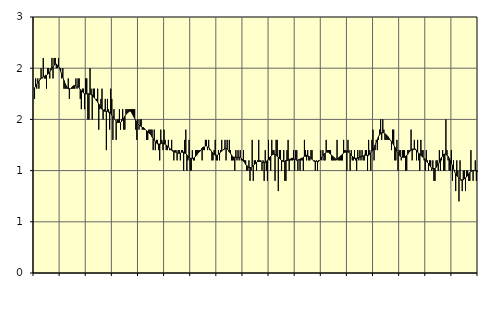
| Category | Jordbruk, skogsbruk o fiske, SNI 01-03 | Series 1 |
|---|---|---|
| nan | 1.7 | 1.81 |
| 87.0 | 1.9 | 1.82 |
| 87.0 | 1.8 | 1.84 |
| 87.0 | 1.9 | 1.86 |
| 87.0 | 1.8 | 1.87 |
| 87.0 | 1.9 | 1.89 |
| 87.0 | 2 | 1.9 |
| 87.0 | 1.9 | 1.91 |
| 87.0 | 2.1 | 1.92 |
| 87.0 | 1.9 | 1.92 |
| 87.0 | 1.9 | 1.93 |
| 87.0 | 1.8 | 1.93 |
| nan | 2 | 1.94 |
| 88.0 | 2 | 1.95 |
| 88.0 | 1.9 | 1.96 |
| 88.0 | 2 | 1.98 |
| 88.0 | 2.1 | 2 |
| 88.0 | 1.9 | 2.01 |
| 88.0 | 2.1 | 2.03 |
| 88.0 | 2.1 | 2.04 |
| 88.0 | 2 | 2.04 |
| 88.0 | 2 | 2.03 |
| 88.0 | 2.1 | 2.02 |
| 88.0 | 2 | 2 |
| nan | 2 | 1.97 |
| 89.0 | 1.9 | 1.94 |
| 89.0 | 2 | 1.91 |
| 89.0 | 1.8 | 1.88 |
| 89.0 | 1.8 | 1.85 |
| 89.0 | 1.8 | 1.83 |
| 89.0 | 1.8 | 1.81 |
| 89.0 | 1.9 | 1.8 |
| 89.0 | 1.7 | 1.8 |
| 89.0 | 1.8 | 1.8 |
| 89.0 | 1.8 | 1.81 |
| 89.0 | 1.8 | 1.82 |
| nan | 1.8 | 1.83 |
| 90.0 | 1.8 | 1.83 |
| 90.0 | 1.9 | 1.83 |
| 90.0 | 1.8 | 1.82 |
| 90.0 | 1.9 | 1.82 |
| 90.0 | 1.9 | 1.81 |
| 90.0 | 1.7 | 1.79 |
| 90.0 | 1.6 | 1.78 |
| 90.0 | 1.8 | 1.77 |
| 90.0 | 1.8 | 1.76 |
| 90.0 | 1.6 | 1.75 |
| 90.0 | 1.9 | 1.75 |
| nan | 1.9 | 1.75 |
| 91.0 | 1.5 | 1.75 |
| 91.0 | 1.5 | 1.75 |
| 91.0 | 2 | 1.75 |
| 91.0 | 1.8 | 1.74 |
| 91.0 | 1.5 | 1.74 |
| 91.0 | 1.8 | 1.72 |
| 91.0 | 1.8 | 1.71 |
| 91.0 | 1.7 | 1.7 |
| 91.0 | 1.7 | 1.68 |
| 91.0 | 1.8 | 1.67 |
| 91.0 | 1.4 | 1.65 |
| nan | 1.6 | 1.63 |
| 92.0 | 1.7 | 1.61 |
| 92.0 | 1.8 | 1.6 |
| 92.0 | 1.5 | 1.59 |
| 92.0 | 1.6 | 1.58 |
| 92.0 | 1.7 | 1.58 |
| 92.0 | 1.2 | 1.58 |
| 92.0 | 1.7 | 1.58 |
| 92.0 | 1.6 | 1.57 |
| 92.0 | 1.4 | 1.57 |
| 92.0 | 1.8 | 1.56 |
| 92.0 | 1.7 | 1.54 |
| nan | 1.3 | 1.53 |
| 93.0 | 1.6 | 1.51 |
| 93.0 | 1.5 | 1.5 |
| 93.0 | 1.3 | 1.48 |
| 93.0 | 1.5 | 1.47 |
| 93.0 | 1.5 | 1.47 |
| 93.0 | 1.6 | 1.47 |
| 93.0 | 1.4 | 1.47 |
| 93.0 | 1.5 | 1.48 |
| 93.0 | 1.6 | 1.5 |
| 93.0 | 1.4 | 1.51 |
| 93.0 | 1.4 | 1.53 |
| nan | 1.6 | 1.55 |
| 94.0 | 1.6 | 1.56 |
| 94.0 | 1.6 | 1.57 |
| 94.0 | 1.6 | 1.58 |
| 94.0 | 1.6 | 1.58 |
| 94.0 | 1.6 | 1.57 |
| 94.0 | 1.6 | 1.55 |
| 94.0 | 1.6 | 1.53 |
| 94.0 | 1.6 | 1.51 |
| 94.0 | 1.4 | 1.49 |
| 94.0 | 1.3 | 1.47 |
| 94.0 | 1.5 | 1.46 |
| nan | 1.4 | 1.44 |
| 95.0 | 1.5 | 1.44 |
| 95.0 | 1.5 | 1.43 |
| 95.0 | 1.4 | 1.42 |
| 95.0 | 1.4 | 1.42 |
| 95.0 | 1.4 | 1.41 |
| 95.0 | 1.4 | 1.4 |
| 95.0 | 1.3 | 1.39 |
| 95.0 | 1.3 | 1.38 |
| 95.0 | 1.4 | 1.37 |
| 95.0 | 1.4 | 1.36 |
| 95.0 | 1.4 | 1.35 |
| nan | 1.4 | 1.33 |
| 96.0 | 1.2 | 1.31 |
| 96.0 | 1.4 | 1.3 |
| 96.0 | 1.2 | 1.28 |
| 96.0 | 1.3 | 1.27 |
| 96.0 | 1.3 | 1.26 |
| 96.0 | 1.2 | 1.26 |
| 96.0 | 1.1 | 1.26 |
| 96.0 | 1.4 | 1.26 |
| 96.0 | 1.3 | 1.27 |
| 96.0 | 1.2 | 1.27 |
| 96.0 | 1.4 | 1.26 |
| nan | 1.3 | 1.26 |
| 97.0 | 1.2 | 1.25 |
| 97.0 | 1.2 | 1.24 |
| 97.0 | 1.3 | 1.23 |
| 97.0 | 1.2 | 1.22 |
| 97.0 | 1.2 | 1.21 |
| 97.0 | 1.3 | 1.2 |
| 97.0 | 1.2 | 1.19 |
| 97.0 | 1.1 | 1.19 |
| 97.0 | 1.2 | 1.18 |
| 97.0 | 1.2 | 1.18 |
| 97.0 | 1.1 | 1.17 |
| nan | 1.2 | 1.17 |
| 98.0 | 1.2 | 1.17 |
| 98.0 | 1.1 | 1.17 |
| 98.0 | 1.2 | 1.18 |
| 98.0 | 1.2 | 1.18 |
| 98.0 | 1 | 1.18 |
| 98.0 | 1.3 | 1.17 |
| 98.0 | 1.4 | 1.17 |
| 98.0 | 1 | 1.15 |
| 98.0 | 1.1 | 1.14 |
| 98.0 | 1.3 | 1.13 |
| 98.0 | 1 | 1.12 |
| nan | 1 | 1.12 |
| 99.0 | 1.2 | 1.12 |
| 99.0 | 1.1 | 1.12 |
| 99.0 | 1.1 | 1.13 |
| 99.0 | 1.2 | 1.14 |
| 99.0 | 1.2 | 1.15 |
| 99.0 | 1.2 | 1.17 |
| 99.0 | 1.2 | 1.18 |
| 99.0 | 1.2 | 1.19 |
| 99.0 | 1.2 | 1.2 |
| 99.0 | 1.1 | 1.22 |
| 99.0 | 1.2 | 1.23 |
| nan | 1.2 | 1.23 |
| 0.0 | 1.3 | 1.24 |
| 0.0 | 1.3 | 1.24 |
| 0.0 | 1.2 | 1.23 |
| 0.0 | 1.3 | 1.23 |
| 0.0 | 1.2 | 1.21 |
| 0.0 | 1.2 | 1.2 |
| 0.0 | 1.1 | 1.18 |
| 0.0 | 1.1 | 1.17 |
| 0.0 | 1.2 | 1.16 |
| 0.0 | 1.3 | 1.15 |
| 0.0 | 1.1 | 1.15 |
| nan | 1.1 | 1.15 |
| 1.0 | 1.2 | 1.16 |
| 1.0 | 1.1 | 1.17 |
| 1.0 | 1.2 | 1.18 |
| 1.0 | 1.3 | 1.19 |
| 1.0 | 1.2 | 1.2 |
| 1.0 | 1.2 | 1.21 |
| 1.0 | 1.3 | 1.22 |
| 1.0 | 1.1 | 1.22 |
| 1.0 | 1.3 | 1.21 |
| 1.0 | 1.2 | 1.2 |
| 1.0 | 1.3 | 1.18 |
| nan | 1.2 | 1.17 |
| 2.0 | 1.1 | 1.15 |
| 2.0 | 1.1 | 1.14 |
| 2.0 | 1.1 | 1.13 |
| 2.0 | 1 | 1.13 |
| 2.0 | 1.2 | 1.13 |
| 2.0 | 1.1 | 1.13 |
| 2.0 | 1.2 | 1.13 |
| 2.0 | 1.1 | 1.13 |
| 2.0 | 1.2 | 1.13 |
| 2.0 | 1.1 | 1.12 |
| 2.0 | 1.1 | 1.11 |
| nan | 1.2 | 1.09 |
| 3.0 | 1.1 | 1.08 |
| 3.0 | 1.1 | 1.06 |
| 3.0 | 1 | 1.05 |
| 3.0 | 1 | 1.04 |
| 3.0 | 1.1 | 1.03 |
| 3.0 | 0.9 | 1.03 |
| 3.0 | 1 | 1.03 |
| 3.0 | 1.3 | 1.04 |
| 3.0 | 0.9 | 1.05 |
| 3.0 | 1.1 | 1.06 |
| 3.0 | 1.1 | 1.07 |
| nan | 1 | 1.08 |
| 4.0 | 1.1 | 1.09 |
| 4.0 | 1.3 | 1.09 |
| 4.0 | 1.1 | 1.09 |
| 4.0 | 1.1 | 1.09 |
| 4.0 | 1 | 1.08 |
| 4.0 | 1.1 | 1.08 |
| 4.0 | 0.9 | 1.08 |
| 4.0 | 1.2 | 1.08 |
| 4.0 | 1 | 1.09 |
| 4.0 | 0.9 | 1.1 |
| 4.0 | 1.3 | 1.11 |
| nan | 1.1 | 1.13 |
| 5.0 | 1 | 1.14 |
| 5.0 | 1.3 | 1.15 |
| 5.0 | 1.2 | 1.16 |
| 5.0 | 1.2 | 1.16 |
| 5.0 | 0.9 | 1.16 |
| 5.0 | 1.3 | 1.15 |
| 5.0 | 1.3 | 1.14 |
| 5.0 | 0.8 | 1.13 |
| 5.0 | 1.2 | 1.12 |
| 5.0 | 1.2 | 1.11 |
| 5.0 | 1 | 1.1 |
| nan | 1.1 | 1.09 |
| 6.0 | 1.2 | 1.09 |
| 6.0 | 0.9 | 1.09 |
| 6.0 | 0.9 | 1.1 |
| 6.0 | 1.2 | 1.1 |
| 6.0 | 1.3 | 1.1 |
| 6.0 | 1 | 1.11 |
| 6.0 | 1.1 | 1.11 |
| 6.0 | 1.1 | 1.12 |
| 6.0 | 1.1 | 1.12 |
| 6.0 | 1.2 | 1.11 |
| 6.0 | 1 | 1.11 |
| nan | 1.2 | 1.11 |
| 7.0 | 1.2 | 1.1 |
| 7.0 | 1 | 1.1 |
| 7.0 | 1.1 | 1.11 |
| 7.0 | 1 | 1.11 |
| 7.0 | 1.1 | 1.12 |
| 7.0 | 1.1 | 1.12 |
| 7.0 | 1 | 1.13 |
| 7.0 | 1.3 | 1.14 |
| 7.0 | 1.2 | 1.14 |
| 7.0 | 1.1 | 1.15 |
| 7.0 | 1.2 | 1.14 |
| nan | 1.1 | 1.14 |
| 8.0 | 1.1 | 1.13 |
| 8.0 | 1.2 | 1.12 |
| 8.0 | 1.2 | 1.11 |
| 8.0 | 1.1 | 1.1 |
| 8.0 | 1.1 | 1.09 |
| 8.0 | 1 | 1.09 |
| 8.0 | 1.1 | 1.09 |
| 8.0 | 1 | 1.09 |
| 8.0 | 1.1 | 1.09 |
| 8.0 | 1.1 | 1.1 |
| 8.0 | 1.2 | 1.11 |
| nan | 1.1 | 1.13 |
| 9.0 | 1.2 | 1.15 |
| 9.0 | 1.1 | 1.16 |
| 9.0 | 1.1 | 1.17 |
| 9.0 | 1.3 | 1.18 |
| 9.0 | 1.2 | 1.18 |
| 9.0 | 1.2 | 1.18 |
| 9.0 | 1.2 | 1.17 |
| 9.0 | 1.2 | 1.16 |
| 9.0 | 1.1 | 1.15 |
| 9.0 | 1.1 | 1.14 |
| 9.0 | 1.1 | 1.13 |
| nan | 1.1 | 1.12 |
| 10.0 | 1.1 | 1.11 |
| 10.0 | 1.3 | 1.11 |
| 10.0 | 1.1 | 1.12 |
| 10.0 | 1.1 | 1.13 |
| 10.0 | 1.1 | 1.14 |
| 10.0 | 1.1 | 1.15 |
| 10.0 | 1.1 | 1.16 |
| 10.0 | 1.3 | 1.17 |
| 10.0 | 1.2 | 1.18 |
| 10.0 | 1.2 | 1.18 |
| 10.0 | 1 | 1.19 |
| nan | 1.3 | 1.18 |
| 11.0 | 1.2 | 1.18 |
| 11.0 | 1 | 1.16 |
| 11.0 | 1.2 | 1.15 |
| 11.0 | 1.1 | 1.14 |
| 11.0 | 1.1 | 1.13 |
| 11.0 | 1.2 | 1.12 |
| 11.0 | 1.1 | 1.12 |
| 11.0 | 1 | 1.12 |
| 11.0 | 1.2 | 1.12 |
| 11.0 | 1.1 | 1.13 |
| 11.0 | 1.2 | 1.13 |
| nan | 1.1 | 1.14 |
| 12.0 | 1.2 | 1.14 |
| 12.0 | 1.1 | 1.14 |
| 12.0 | 1.1 | 1.15 |
| 12.0 | 1.2 | 1.15 |
| 12.0 | 1.2 | 1.15 |
| 12.0 | 1 | 1.15 |
| 12.0 | 1.3 | 1.15 |
| 12.0 | 1.2 | 1.16 |
| 12.0 | 1 | 1.17 |
| 12.0 | 1.3 | 1.19 |
| 12.0 | 1.4 | 1.2 |
| nan | 1.1 | 1.22 |
| 13.0 | 1.2 | 1.25 |
| 13.0 | 1.3 | 1.28 |
| 13.0 | 1.2 | 1.3 |
| 13.0 | 1.3 | 1.33 |
| 13.0 | 1.4 | 1.35 |
| 13.0 | 1.5 | 1.36 |
| 13.0 | 1.3 | 1.37 |
| 13.0 | 1.5 | 1.37 |
| 13.0 | 1.4 | 1.37 |
| 13.0 | 1.3 | 1.36 |
| 13.0 | 1.3 | 1.35 |
| nan | 1.3 | 1.34 |
| 14.0 | 1.3 | 1.33 |
| 14.0 | 1.3 | 1.31 |
| 14.0 | 1.3 | 1.3 |
| 14.0 | 1.2 | 1.28 |
| 14.0 | 1.4 | 1.27 |
| 14.0 | 1.4 | 1.25 |
| 14.0 | 1.1 | 1.23 |
| 14.0 | 1.1 | 1.21 |
| 14.0 | 1.3 | 1.19 |
| 14.0 | 1 | 1.17 |
| 14.0 | 1.2 | 1.16 |
| nan | 1.2 | 1.14 |
| 15.0 | 1.1 | 1.13 |
| 15.0 | 1.2 | 1.13 |
| 15.0 | 1.2 | 1.13 |
| 15.0 | 1.2 | 1.13 |
| 15.0 | 1 | 1.14 |
| 15.0 | 1 | 1.15 |
| 15.0 | 1.2 | 1.16 |
| 15.0 | 1.2 | 1.18 |
| 15.0 | 1.2 | 1.19 |
| 15.0 | 1.4 | 1.2 |
| 15.0 | 1.1 | 1.21 |
| nan | 1.2 | 1.21 |
| 16.0 | 1.3 | 1.21 |
| 16.0 | 1.2 | 1.21 |
| 16.0 | 1.1 | 1.2 |
| 16.0 | 1.3 | 1.18 |
| 16.0 | 1.1 | 1.17 |
| 16.0 | 1 | 1.16 |
| 16.0 | 1.3 | 1.15 |
| 16.0 | 1.2 | 1.14 |
| 16.0 | 1.2 | 1.13 |
| 16.0 | 1.1 | 1.12 |
| 16.0 | 1 | 1.11 |
| nan | 1.2 | 1.1 |
| 17.0 | 1.1 | 1.08 |
| 17.0 | 1 | 1.07 |
| 17.0 | 1.1 | 1.05 |
| 17.0 | 1.1 | 1.04 |
| 17.0 | 1 | 1.02 |
| 17.0 | 1.1 | 1.02 |
| 17.0 | 0.9 | 1.02 |
| 17.0 | 0.9 | 1.02 |
| 17.0 | 1.1 | 1.03 |
| 17.0 | 1.1 | 1.05 |
| 17.0 | 1 | 1.06 |
| nan | 1.2 | 1.08 |
| 18.0 | 1 | 1.11 |
| 18.0 | 1.1 | 1.13 |
| 18.0 | 1.2 | 1.14 |
| 18.0 | 1 | 1.16 |
| 18.0 | 1 | 1.16 |
| 18.0 | 1.5 | 1.16 |
| 18.0 | 1.2 | 1.15 |
| 18.0 | 1.1 | 1.14 |
| 18.0 | 1 | 1.12 |
| 18.0 | 1 | 1.1 |
| 18.0 | 1.2 | 1.07 |
| nan | 0.9 | 1.05 |
| 19.0 | 1.1 | 1.02 |
| 19.0 | 1 | 0.99 |
| 19.0 | 0.8 | 0.97 |
| 19.0 | 1.1 | 0.95 |
| 19.0 | 1 | 0.94 |
| 19.0 | 0.7 | 0.93 |
| 19.0 | 1.1 | 0.92 |
| 19.0 | 0.9 | 0.91 |
| 19.0 | 0.8 | 0.91 |
| 19.0 | 1 | 0.91 |
| 19.0 | 1 | 0.92 |
| nan | 0.8 | 0.93 |
| 20.0 | 1 | 0.94 |
| 20.0 | 1 | 0.95 |
| 20.0 | 0.9 | 0.97 |
| 20.0 | 0.9 | 0.98 |
| 20.0 | 1.2 | 0.99 |
| 20.0 | 1 | 1 |
| 20.0 | 0.9 | 1 |
| 20.0 | 1 | 1 |
| 20.0 | 1.1 | 1 |
| 20.0 | 0.9 | 1 |
| 20.0 | 1 | 0.99 |